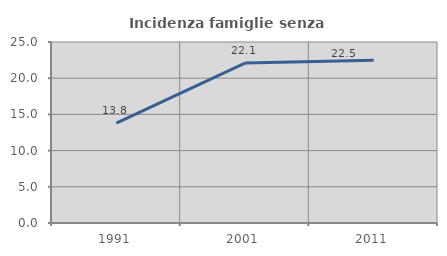
| Category | Incidenza famiglie senza nuclei |
|---|---|
| 1991.0 | 13.801 |
| 2001.0 | 22.097 |
| 2011.0 | 22.476 |